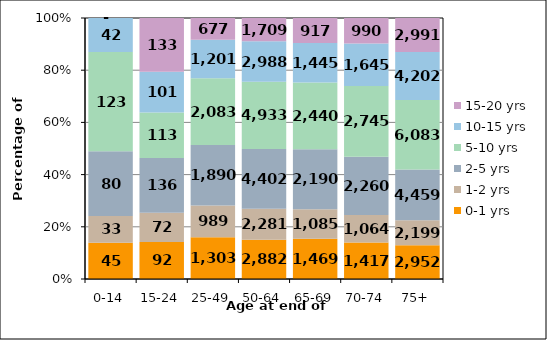
| Category | 0-1 yrs | 1-2 yrs | 2-5 yrs | 5-10 yrs | 10-15 yrs | 15-20 yrs |
|---|---|---|---|---|---|---|
| 0-14 | 45 | 33 | 80 | 123 | 42 | 0 |
| 15-24 | 92 | 72 | 136 | 113 | 101 | 133 |
| 25-49 | 1303 | 989 | 1890 | 2083 | 1201 | 677 |
| 50-64 | 2882 | 2281 | 4402 | 4933 | 2988 | 1709 |
| 65-69 | 1469 | 1085 | 2190 | 2440 | 1445 | 917 |
| 70-74 | 1417 | 1064 | 2260 | 2745 | 1645 | 990 |
| 75+ | 2952 | 2199 | 4459 | 6083 | 4202 | 2991 |